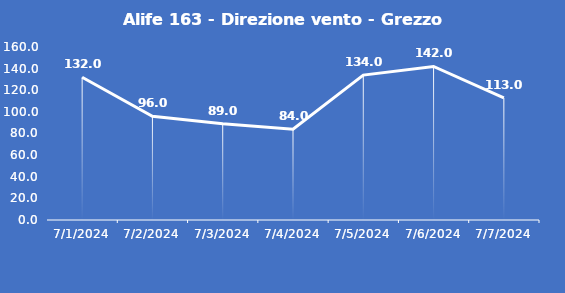
| Category | Alife 163 - Direzione vento - Grezzo (°N) |
|---|---|
| 7/1/24 | 132 |
| 7/2/24 | 96 |
| 7/3/24 | 89 |
| 7/4/24 | 84 |
| 7/5/24 | 134 |
| 7/6/24 | 142 |
| 7/7/24 | 113 |